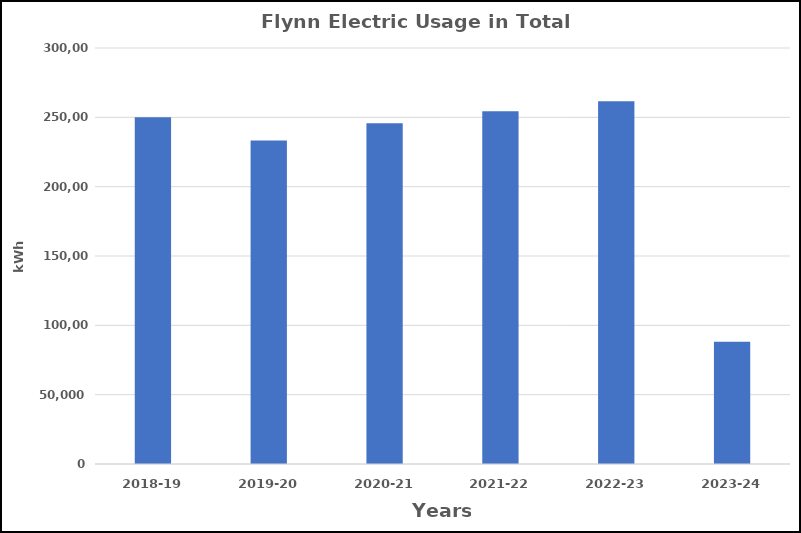
| Category | Series 0 |
|---|---|
| 2018-19 | 250038 |
| 2019-20 | 233213 |
| 2020-21 | 245734 |
| 2021-22 | 254333 |
| 2022-23 | 261579 |
| 2023-24 | 88112 |